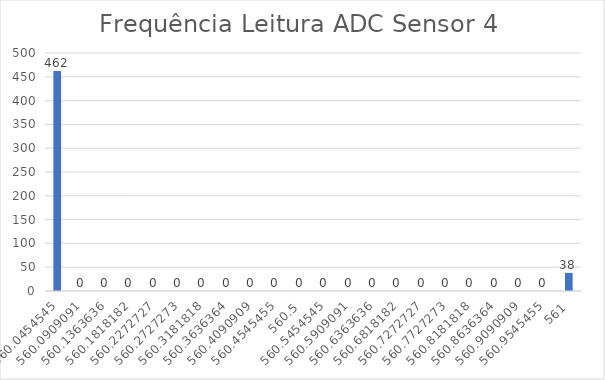
| Category | Series 0 |
|---|---|
| 560.0454545454545 | 462 |
| 560.0909090909091 | 0 |
| 560.1363636363636 | 0 |
| 560.1818181818181 | 0 |
| 560.2272727272727 | 0 |
| 560.2727272727273 | 0 |
| 560.3181818181819 | 0 |
| 560.3636363636364 | 0 |
| 560.4090909090909 | 0 |
| 560.4545454545455 | 0 |
| 560.5 | 0 |
| 560.5454545454545 | 0 |
| 560.5909090909091 | 0 |
| 560.6363636363636 | 0 |
| 560.6818181818181 | 0 |
| 560.7272727272727 | 0 |
| 560.7727272727273 | 0 |
| 560.8181818181819 | 0 |
| 560.8636363636364 | 0 |
| 560.9090909090909 | 0 |
| 560.9545454545455 | 0 |
| 561.0 | 38 |